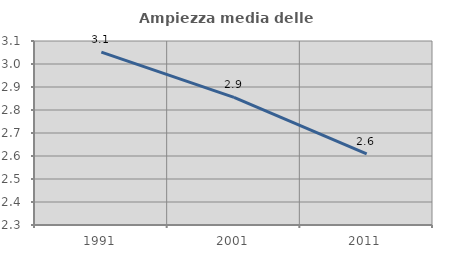
| Category | Ampiezza media delle famiglie |
|---|---|
| 1991.0 | 3.052 |
| 2001.0 | 2.855 |
| 2011.0 | 2.609 |